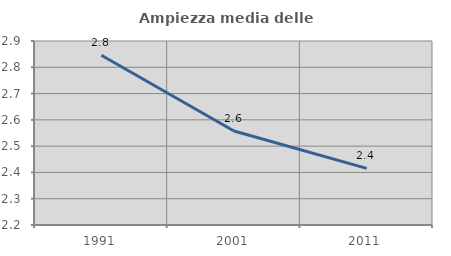
| Category | Ampiezza media delle famiglie |
|---|---|
| 1991.0 | 2.846 |
| 2001.0 | 2.558 |
| 2011.0 | 2.415 |